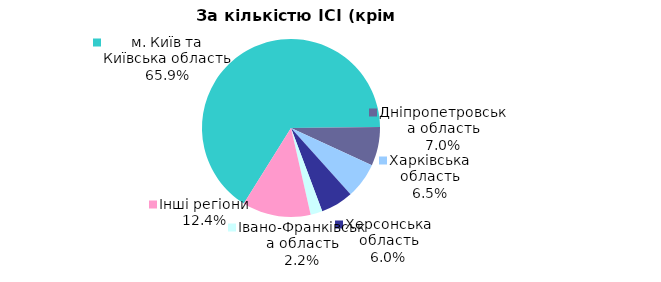
| Category | Series 0 |
|---|---|
| м. Київ та Київська область | 0.718 |
| Дніпропетровська область | 0.076 |
| Харківська область | 0.071 |
| Херсонська область | 0.065 |
| Iвано-Франкiвська область | 0.024 |
| Інші регіони | 0.135 |